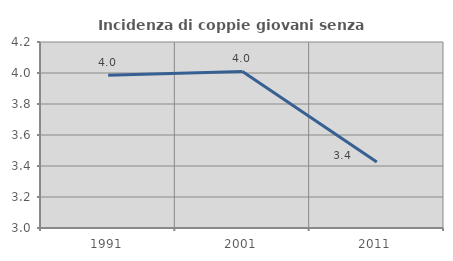
| Category | Incidenza di coppie giovani senza figli |
|---|---|
| 1991.0 | 3.985 |
| 2001.0 | 4.01 |
| 2011.0 | 3.426 |